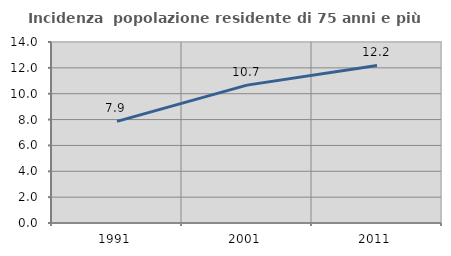
| Category | Incidenza  popolazione residente di 75 anni e più |
|---|---|
| 1991.0 | 7.86 |
| 2001.0 | 10.664 |
| 2011.0 | 12.186 |